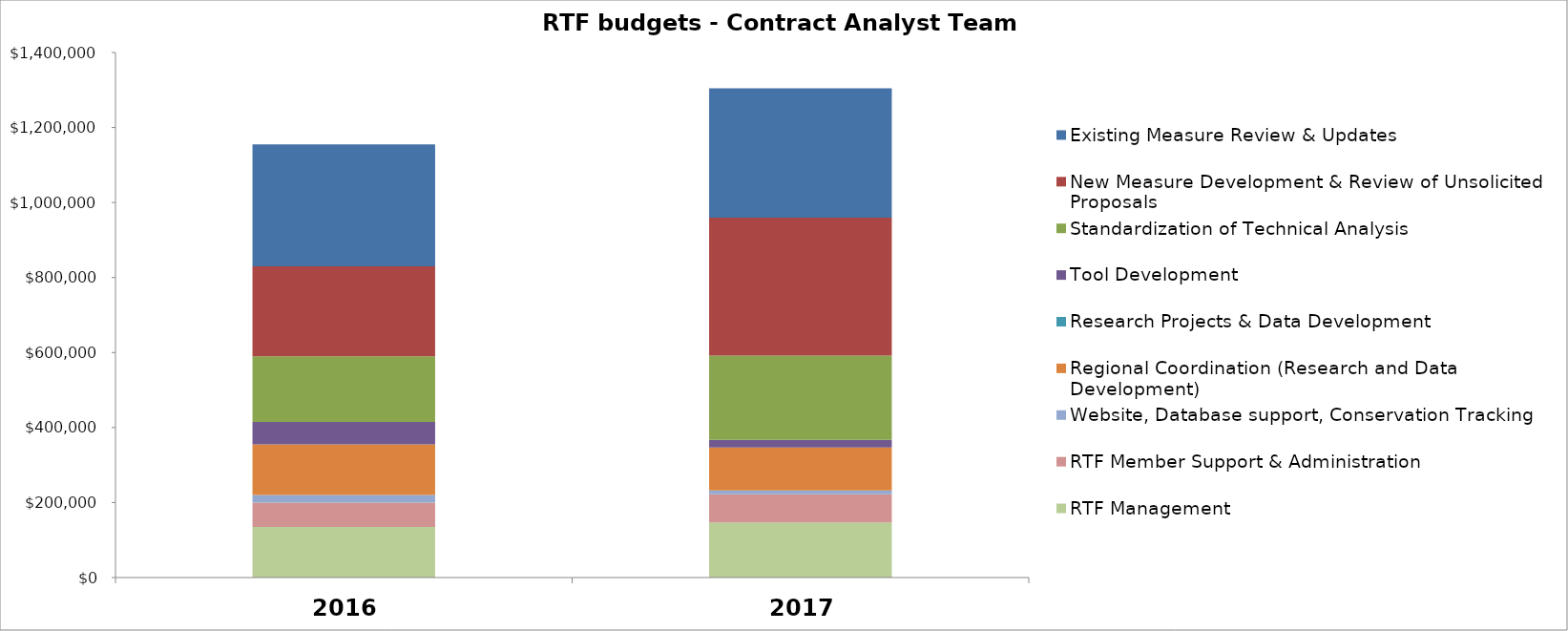
| Category | RTF Management | RTF Member Support & Administration | Website, Database support, Conservation Tracking  | Regional Coordination (Research and Data Development) | Research Projects & Data Development | Tool Development | Standardization of Technical Analysis | New Measure Development & Review of Unsolicited Proposals | Existing Measure Review & Updates |
|---|---|---|---|---|---|---|---|---|---|
| 0 | 135000 | 65000 | 20000 | 135000 | 0 | 60000 | 175000 | 240000 | 325000 |
| 1 | 147000 | 75000 | 10000 | 115000 | 0 | 20000 | 225000 | 367500 | 345000 |